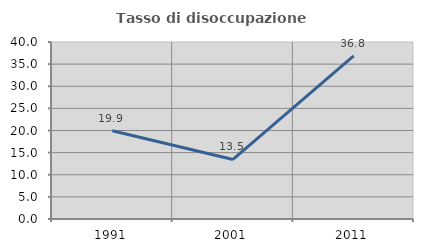
| Category | Tasso di disoccupazione giovanile  |
|---|---|
| 1991.0 | 19.939 |
| 2001.0 | 13.462 |
| 2011.0 | 36.842 |